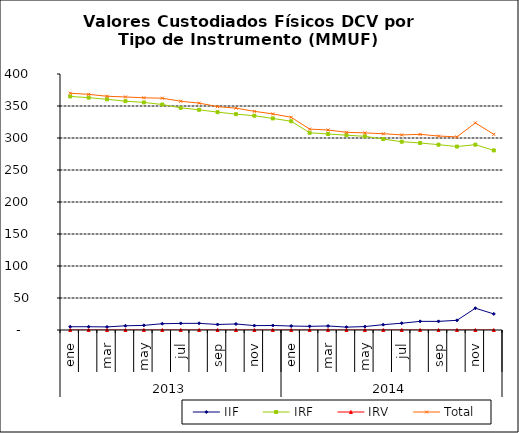
| Category | IIF | IRF | IRV | Total |
|---|---|---|---|---|
| 0 | 5.08 | 364.889 | 0 | 369.968 |
| 1900-01-01 | 5.148 | 363.074 | 0 | 368.222 |
| 1900-01-02 | 4.791 | 360.452 | 0 | 365.243 |
| 1900-01-03 | 6.578 | 357.548 | 0 | 364.126 |
| 1900-01-04 | 7.24 | 355.611 | 0 | 362.85 |
| 1900-01-05 | 9.833 | 352.32 | 0 | 362.153 |
| 1900-01-06 | 10.319 | 347.126 | 0 | 357.445 |
| 1900-01-07 | 10.412 | 344.085 | 0 | 354.497 |
| 1900-01-08 | 8.634 | 340.411 | 0 | 349.045 |
| 1900-01-09 | 9.402 | 337.233 | 0 | 346.635 |
| 1900-01-10 | 6.847 | 334.809 | 0 | 341.656 |
| 1900-01-11 | 7.056 | 330.604 | 0 | 337.66 |
| 1900-01-12 | 6.204 | 326.158 | 0 | 332.362 |
| 1900-01-13 | 5.723 | 308.152 | 0 | 313.875 |
| 1900-01-14 | 6.28 | 306.227 | 0 | 312.507 |
| 1900-01-15 | 4.489 | 304.405 | 0 | 308.893 |
| 1900-01-16 | 5.367 | 302.62 | 0 | 307.987 |
| 1900-01-17 | 8.339 | 298.347 | 0 | 306.686 |
| 1900-01-18 | 10.581 | 294.237 | 0 | 304.818 |
| 1900-01-19 | 13.479 | 292.21 | 0 | 305.689 |
| 1900-01-20 | 13.501 | 289.585 | 0 | 303.086 |
| 1900-01-21 | 15.113 | 286.64 | 0 | 301.754 |
| 1900-01-22 | 34.055 | 289.592 | 0 | 323.647 |
| 1900-01-23 | 25.109 | 280.567 | 0 | 305.676 |